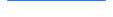
| Category | Series 0 |
|---|---|
| 0 | 117 |
| 1 | 116 |
| 2 | 111 |
| 3 | 107 |
| 4 | 133 |
| 5 | 111 |
| 6 | 112 |
| 7 | 107 |
| 8 | 111 |